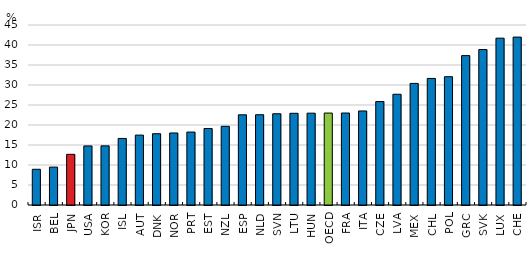
| Category | 2021 or latest year available |
|---|---|
| ISR | 8.927 |
| BEL | 9.474 |
| JPN | 12.669 |
| USA | 14.762 |
| KOR | 14.784 |
| ISL | 16.643 |
| AUT | 17.473 |
| DNK | 17.822 |
| NOR | 18.005 |
| PRT | 18.236 |
| EST | 19.128 |
| NZL | 19.673 |
| ESP | 22.549 |
| NLD | 22.567 |
| SVN | 22.812 |
| LTU | 22.927 |
| HUN | 22.958 |
| OECD | 22.987 |
| FRA | 22.993 |
| ITA | 23.511 |
| CZE | 25.865 |
| LVA | 27.684 |
| MEX | 30.4 |
| CHL | 31.639 |
| POL | 32.074 |
| GRC | 37.351 |
| SVK | 38.859 |
| LUX | 41.705 |
| CHE | 41.974 |